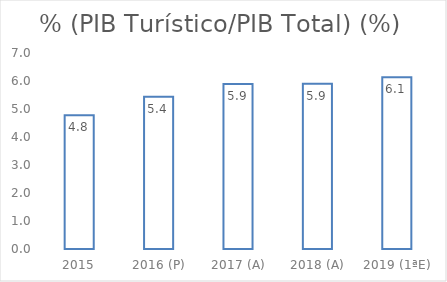
| Category | % (PIB Turístico/PIB Total) (%) |
|---|---|
| 2015 | 4.777 |
| 2016 (P) | 5.435 |
| 2017 (A) | 5.889 |
| 2018 (A) | 5.902 |
| 2019 (1ªE) | 6.134 |